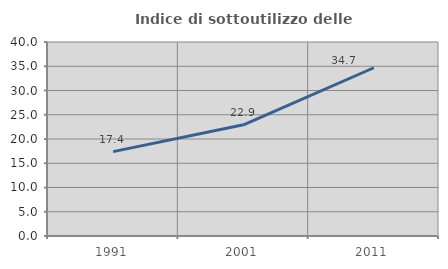
| Category | Indice di sottoutilizzo delle abitazioni  |
|---|---|
| 1991.0 | 17.391 |
| 2001.0 | 22.923 |
| 2011.0 | 34.691 |